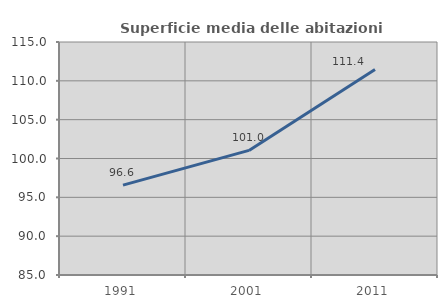
| Category | Superficie media delle abitazioni occupate |
|---|---|
| 1991.0 | 96.576 |
| 2001.0 | 101.042 |
| 2011.0 | 111.448 |